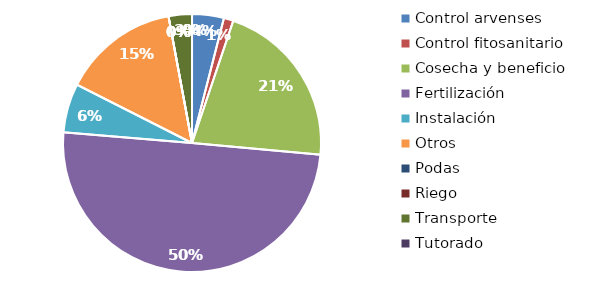
| Category | Valor |
|---|---|
| Control arvenses | 1200000 |
| Control fitosanitario | 360000 |
| Cosecha y beneficio | 6400000 |
| Fertilización | 15016000 |
| Instalación | 1848000 |
| Otros | 4400000 |
| Podas | 0 |
| Riego | 0 |
| Transporte | 880000 |
| Tutorado | 0 |